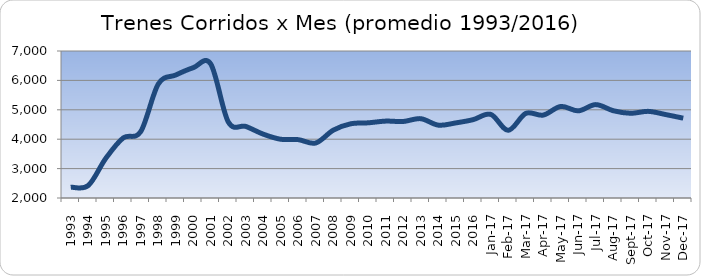
| Category | Series 0 |
|---|---|
| 1993.0 | 2368.667 |
| 1994.0 | 2424.667 |
| 1995.0 | 3347.75 |
| 1996.0 | 4044 |
| 1997.0 | 4260.583 |
| 1998.0 | 5875.25 |
| 1999.0 | 6183.917 |
| 2000.0 | 6432 |
| 2001.0 | 6558.167 |
| 2002.0 | 4590.667 |
| 2003.0 | 4434.417 |
| 2004.0 | 4171.417 |
| 2005.0 | 3998 |
| 2006.0 | 3985 |
| 2007.0 | 3870.75 |
| 2008.0 | 4307.083 |
| 2009.0 | 4524.25 |
| 2010.0 | 4557 |
| 2011.0 | 4615.667 |
| 2012.0 | 4602.417 |
| 2013.0 | 4698.167 |
| 2014.0 | 4478.083 |
| 2015.0 | 4553.833 |
| 2016.0 | 4665.833 |
| 42736.0 | 4844 |
| 42767.0 | 4302 |
| 42795.0 | 4877 |
| 42826.0 | 4820 |
| 42856.0 | 5114 |
| 42887.0 | 4964 |
| 42917.0 | 5177 |
| 42948.0 | 4969 |
| 42979.0 | 4881 |
| 43009.0 | 4947 |
| 43040.0 | 4838 |
| 43070.0 | 4715 |